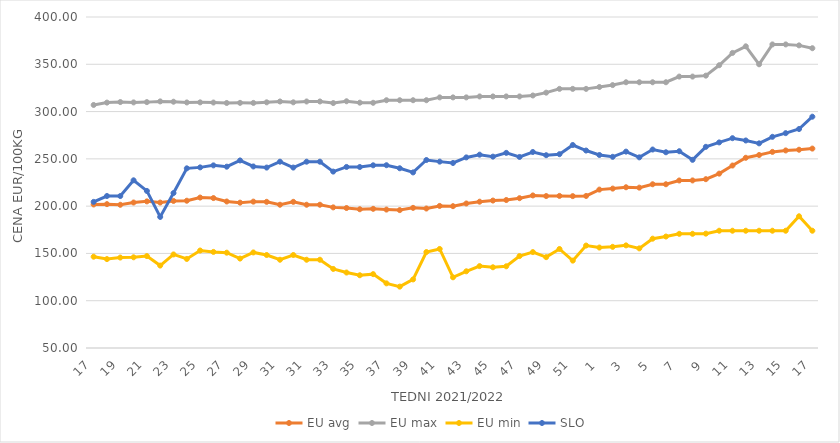
| Category | EU avg | EU max | EU min | SLO |
|---|---|---|---|---|
| 17.0 | 201.754 | 306.98 | 146.538 | 204.51 |
| 18.0 | 202.13 | 309.49 | 144.017 | 210.72 |
| 19.0 | 201.439 | 310.06 | 145.644 | 210.68 |
| 20.0 | 203.834 | 309.69 | 145.911 | 227.32 |
| 21.0 | 205.04 | 309.99 | 147.188 | 216.08 |
| 22.0 | 203.79 | 310.76 | 137.177 | 188.6 |
| 23.0 | 205.51 | 310.41 | 148.928 | 213.84 |
| 24.0 | 205.73 | 309.64 | 144.161 | 239.99 |
| 25.0 | 209.095 | 309.74 | 153.081 | 240.99 |
| 26.0 | 208.551 | 309.55 | 151.599 | 243.11 |
| 27.0 | 204.914 | 309.08 | 150.789 | 241.72 |
| 28.0 | 203.681 | 309.21 | 144.56 | 248.33 |
| 29.0 | 204.773 | 309.15 | 151.052 | 241.96 |
| 30.0 | 204.558 | 309.78 | 148.33 | 240.79 |
| 31.0 | 201.483 | 310.67 | 143.33 | 247 |
| 30.0 | 204.558 | 309.78 | 148.33 | 240.79 |
| 31.0 | 201.483 | 310.67 | 143.33 | 247 |
| 32.0 | 201.483 | 310.67 | 143.33 | 247 |
| 33.0 | 198.691 | 309 | 133.607 | 236.54 |
| 34.0 | 198.027 | 310.9 | 129.797 | 241.45 |
| 35.0 | 196.72 | 309.41 | 126.926 | 241.39 |
| 36.0 | 197.157 | 309.28 | 128.099 | 243.19 |
| 37.0 | 196.375 | 312 | 118.364 | 243.28 |
| 38.0 | 195.821 | 312 | 114.892 | 240.06 |
| 39.0 | 198.179 | 312 | 122.517 | 235.66 |
| 40.0 | 197.482 | 312 | 151.488 | 248.77 |
| 41.0 | 200.22 | 315 | 154.74 | 247.07 |
| 42.0 | 199.965 | 315 | 124.748 | 245.64 |
| 43.0 | 202.804 | 315 | 131.104 | 251.53 |
| 44.0 | 204.713 | 316 | 136.6 | 254.42 |
| 45.0 | 205.906 | 316 | 135.362 | 252.35 |
| 46.0 | 206.476 | 316 | 136.39 | 256.33 |
| 47.0 | 208.415 | 316 | 147.192 | 252.01 |
| 48.0 | 211.314 | 317 | 151.41 | 257.25 |
| 49.0 | 210.677 | 320 | 146.064 | 253.87 |
| 50.0 | 210.823 | 324 | 154.698 | 254.94 |
| 51.0 | 210.59 | 324 | 142.382 | 264.65 |
| 52.0 | 210.763 | 324 | 158.333 | 258.8 |
| 1.0 | 217.49 | 326 | 156.222 | 254.09 |
| 2.0 | 218.55 | 328 | 156.969 | 252.15 |
| 3.0 | 219.967 | 331 | 158.511 | 257.65 |
| 4.0 | 219.57 | 331 | 155.346 | 251.6 |
| 5.0 | 223.136 | 331 | 165.59 | 259.87 |
| 6.0 | 223.143 | 331 | 167.86 | 256.97 |
| 7.0 | 227.138 | 337 | 170.719 | 258.07 |
| 8.0 | 227.191 | 337 | 170.743 | 248.97 |
| 9.0 | 228.512 | 338 | 170.92 | 262.72 |
| 10.0 | 234.369 | 349 | 174 | 267.38 |
| 11.0 | 242.946 | 362 | 174 | 271.86 |
| 12.0 | 251.132 | 369 | 174 | 269.43 |
| 13.0 | 254.061 | 350 | 174 | 266.39 |
| 14.0 | 257.367 | 371 | 174 | 273.3 |
| 15.0 | 258.893 | 371 | 174 | 277.18 |
| 16.0 | 259.647 | 370 | 189.274 | 281.55 |
| 17.0 | 260.865 | 367 | 174 | 294.59 |